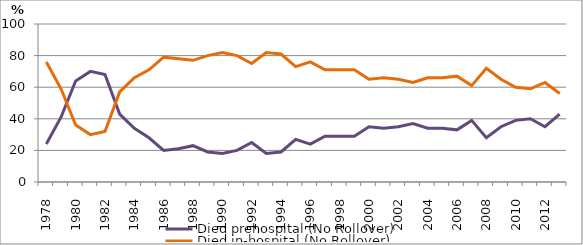
| Category | Died prehospital (No Rollover) | Died in-hospital (No Rollover) |
|---|---|---|
| 1978.0 | 24 | 76 |
| 1979.0 | 41 | 59 |
| 1980.0 | 64 | 36 |
| 1981.0 | 70 | 30 |
| 1982.0 | 68 | 32 |
| 1983.0 | 43 | 57 |
| 1984.0 | 34 | 66 |
| 1985.0 | 28 | 71 |
| 1986.0 | 20 | 79 |
| 1987.0 | 21 | 78 |
| 1988.0 | 23 | 77 |
| 1989.0 | 19 | 80 |
| 1990.0 | 18 | 82 |
| 1991.0 | 20 | 80 |
| 1992.0 | 25 | 75 |
| 1993.0 | 18 | 82 |
| 1994.0 | 19 | 81 |
| 1995.0 | 27 | 73 |
| 1996.0 | 24 | 76 |
| 1997.0 | 29 | 71 |
| 1998.0 | 29 | 71 |
| 1999.0 | 29 | 71 |
| 2000.0 | 35 | 65 |
| 2001.0 | 34 | 66 |
| 2002.0 | 35 | 65 |
| 2003.0 | 37 | 63 |
| 2004.0 | 34 | 66 |
| 2005.0 | 34 | 66 |
| 2006.0 | 33 | 67 |
| 2007.0 | 39 | 61 |
| 2008.0 | 28 | 72 |
| 2009.0 | 35 | 65 |
| 2010.0 | 39 | 60 |
| 2011.0 | 40 | 59 |
| 2012.0 | 35 | 63 |
| 2013.0 | 43 | 56 |